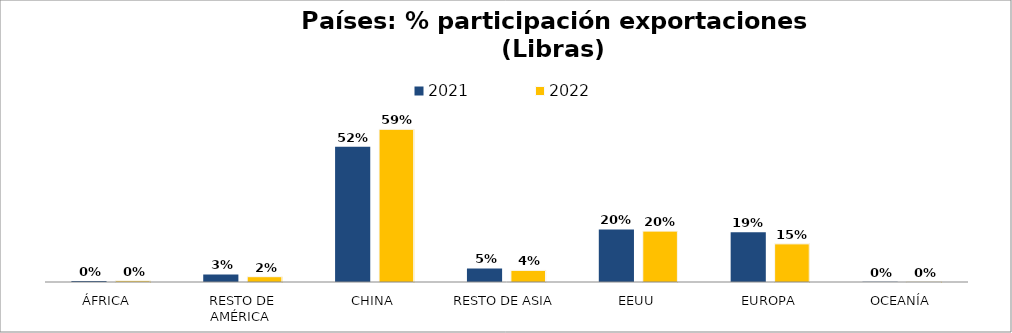
| Category | 2021 | 2022 |
|---|---|---|
| ÁFRICA  | 0.004 | 0.005 |
| RESTO DE AMÉRICA  | 0.029 | 0.02 |
| CHINA | 0.52 | 0.587 |
| RESTO DE ASIA | 0.052 | 0.045 |
| EEUU | 0.202 | 0.196 |
| EUROPA | 0.191 | 0.147 |
| OCEANÍA | 0.001 | 0.001 |